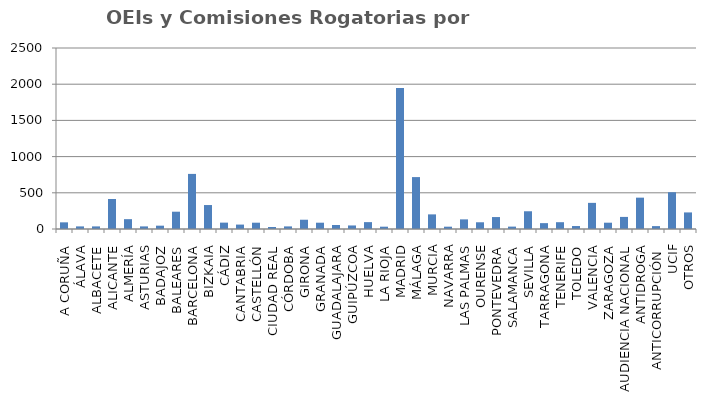
| Category | OEIs y Comisiones Rogatorias |
|---|---|
| A CORUÑA | 92 |
| ÁLAVA | 36 |
| ALBACETE | 36 |
| ALICANTE | 414 |
| ALMERÍA | 136 |
| ASTURIAS | 36 |
| BADAJOZ | 46 |
| BALEARES | 239 |
| BARCELONA | 761 |
| BIZKAIA | 331 |
| CÁDIZ | 88 |
| CANTABRIA | 61 |
| CASTELLÓN | 87 |
| CIUDAD REAL | 28 |
| CÓRDOBA | 36 |
| GIRONA | 128 |
| GRANADA | 87 |
| GUADALAJARA | 55 |
| GUIPÚZCOA | 49 |
| HUELVA | 95 |
| LA RIOJA | 32 |
| MADRID | 1949 |
| MÁLAGA | 717 |
| MURCIA | 202 |
| NAVARRA | 32 |
| LAS PALMAS | 133 |
| OURENSE | 93 |
| PONTEVEDRA | 165 |
| SALAMANCA | 33 |
| SEVILLA | 245 |
| TARRAGONA | 81 |
| TENERIFE | 94 |
| TOLEDO | 41 |
| VALENCIA | 361 |
| ZARAGOZA | 87 |
| AUDIENCIA NACIONAL | 167 |
| ANTIDROGA | 433 |
| ANTICORRUPCIÓN  | 40 |
| UCIF | 508 |
| OTROS | 229 |